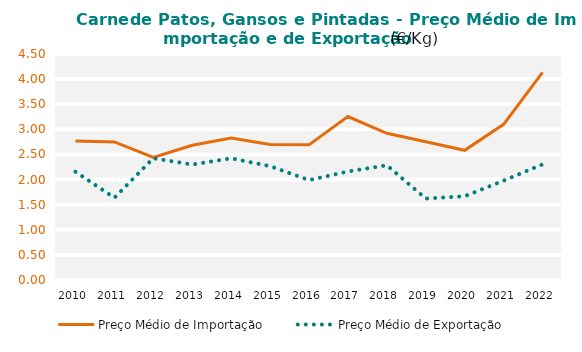
| Category | Preço Médio de Importação | Preço Médio de Exportação |
|---|---|---|
| 2010.0 | 2.766 | 2.156 |
| 2011.0 | 2.748 | 1.638 |
| 2012.0 | 2.439 | 2.424 |
| 2013.0 | 2.683 | 2.299 |
| 2014.0 | 2.827 | 2.423 |
| 2015.0 | 2.699 | 2.267 |
| 2016.0 | 2.691 | 1.989 |
| 2017.0 | 3.255 | 2.161 |
| 2018.0 | 2.921 | 2.284 |
| 2019.0 | 2.754 | 1.622 |
| 2020.0 | 2.582 | 1.667 |
| 2021.0 | 3.099 | 1.979 |
| 2022.0 | 4.134 | 2.302 |